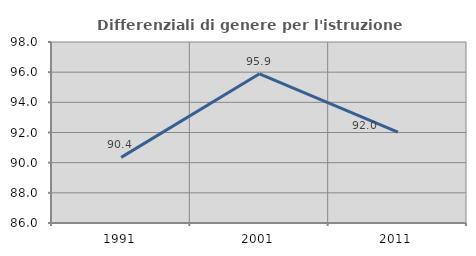
| Category | Differenziali di genere per l'istruzione superiore |
|---|---|
| 1991.0 | 90.352 |
| 2001.0 | 95.891 |
| 2011.0 | 92.028 |